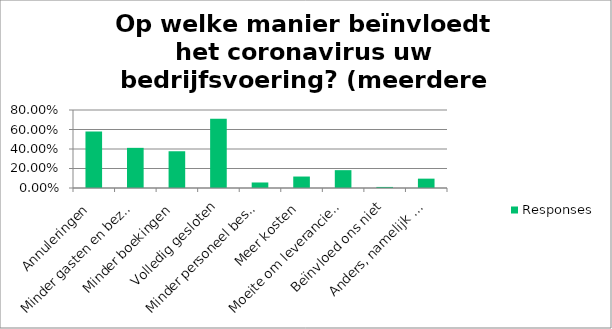
| Category | Responses |
|---|---|
| Annuleringen | 0.58 |
| Minder gasten en bezoekers | 0.412 |
| Minder boekingen | 0.377 |
| Volledig gesloten | 0.71 |
| Minder personeel beschikbaar | 0.057 |
| Meer kosten | 0.118 |
| Moeite om leveranciers te betalen | 0.183 |
| Beïnvloed ons niet | 0.011 |
| Anders, namelijk ... | 0.096 |